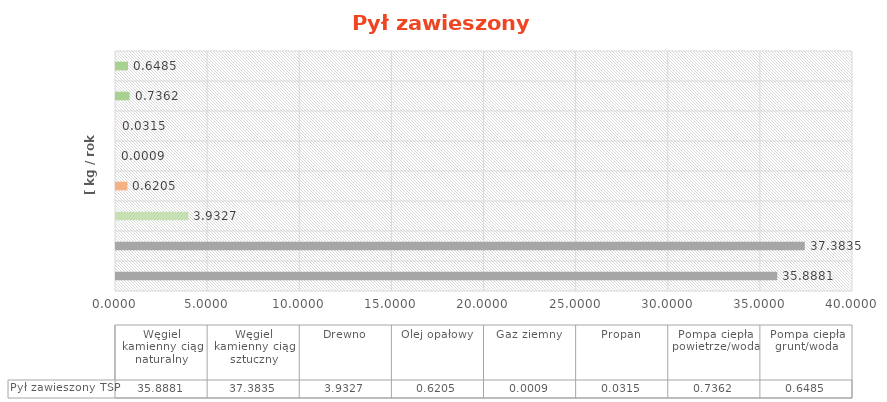
| Category | Pył zawieszony |
|---|---|
| Węgiel kamienny ciąg naturalny | 35.888 |
| Węgiel kamienny ciąg sztuczny | 37.383 |
| Drewno | 3.933 |
| Olej opałowy | 0.621 |
| Gaz ziemny | 0.001 |
| Propan | 0.031 |
| Pompa ciepła powietrze/woda | 0.736 |
| Pompa ciepła grunt/woda | 0.649 |